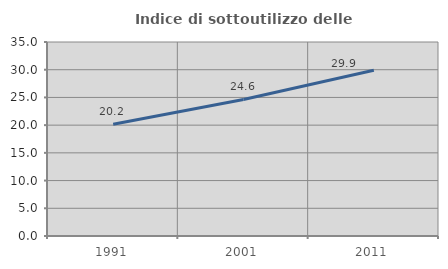
| Category | Indice di sottoutilizzo delle abitazioni  |
|---|---|
| 1991.0 | 20.16 |
| 2001.0 | 24.627 |
| 2011.0 | 29.902 |